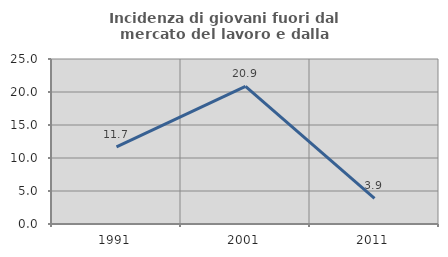
| Category | Incidenza di giovani fuori dal mercato del lavoro e dalla formazione  |
|---|---|
| 1991.0 | 11.688 |
| 2001.0 | 20.863 |
| 2011.0 | 3.883 |